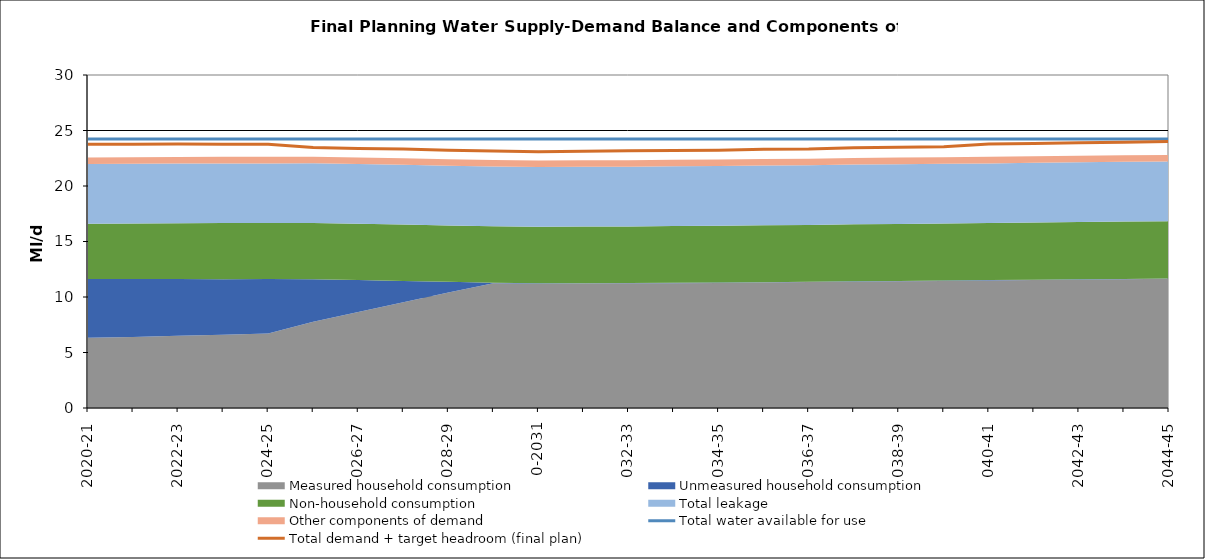
| Category | Total water available for use | Total demand + target headroom (final plan) |
|---|---|---|
| 0 | 24.24 | 23.765 |
| 1 | 24.24 | 23.757 |
| 2 | 24.24 | 23.778 |
| 3 | 24.24 | 23.765 |
| 4 | 24.24 | 23.756 |
| 5 | 24.24 | 23.461 |
| 6 | 24.24 | 23.383 |
| 7 | 24.24 | 23.326 |
| 8 | 24.24 | 23.228 |
| 9 | 24.24 | 23.161 |
| 10 | 24.24 | 23.076 |
| 11 | 24.24 | 23.14 |
| 12 | 24.24 | 23.17 |
| 13 | 24.24 | 23.187 |
| 14 | 24.24 | 23.231 |
| 15 | 24.24 | 23.321 |
| 16 | 24.24 | 23.339 |
| 17 | 24.24 | 23.455 |
| 18 | 24.24 | 23.497 |
| 19 | 24.24 | 23.528 |
| 20 | 24.24 | 23.787 |
| 21 | 24.24 | 23.834 |
| 22 | 24.24 | 23.887 |
| 23 | 24.24 | 23.939 |
| 24 | 24.24 | 24.018 |